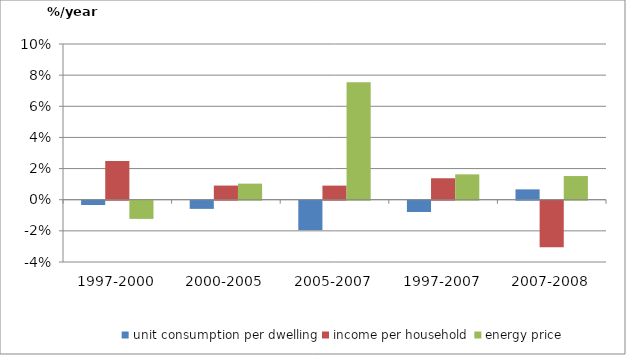
| Category | unit consumption per dwelling | income per household | energy price |
|---|---|---|---|
| 1997-2000 | -0.003 | 0.025 | -0.012 |
| 2000-2005 | -0.005 | 0.009 | 0.01 |
| 2005-2007 | -0.019 | 0.009 | 0.075 |
| 1997-2007 | -0.007 | 0.014 | 0.016 |
| 2007-2008 | 0.007 | -0.03 | 0.015 |